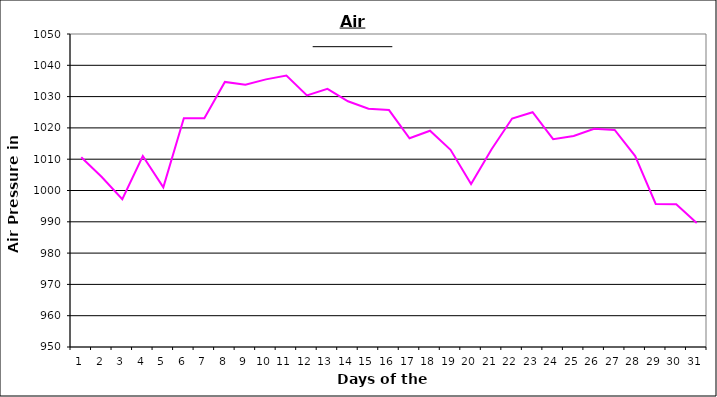
| Category | Series 0 |
|---|---|
| 0 | 1010.6 |
| 1 | 1004.3 |
| 2 | 997.2 |
| 3 | 1011 |
| 4 | 1001 |
| 5 | 1023.1 |
| 6 | 1023.1 |
| 7 | 1034.7 |
| 8 | 1033.8 |
| 9 | 1035.5 |
| 10 | 1036.7 |
| 11 | 1030.4 |
| 12 | 1032.5 |
| 13 | 1028.5 |
| 14 | 1026.1 |
| 15 | 1025.7 |
| 16 | 1016.7 |
| 17 | 1019.1 |
| 18 | 1013 |
| 19 | 1002.1 |
| 20 | 1013.2 |
| 21 | 1023 |
| 22 | 1025 |
| 23 | 1016.4 |
| 24 | 1017.4 |
| 25 | 1019.7 |
| 26 | 1019.33 |
| 27 | 1011 |
| 28 | 995.7 |
| 29 | 995.6 |
| 30 | 989.6 |